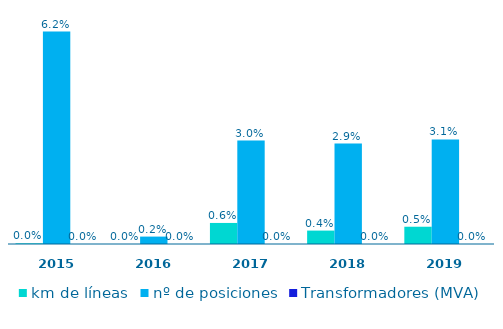
| Category | km de líneas | nº de posiciones | Transformadores (MVA) |
|---|---|---|---|
| 2015.0 | 0 | 0.062 | 0 |
| 2016.0 | 0 | 0.002 | 0 |
| 2017.0 | 0.006 | 0.03 | 0 |
| 2018.0 | 0.004 | 0.029 | 0 |
| 2019.0 | 0.005 | 0.031 | 0 |